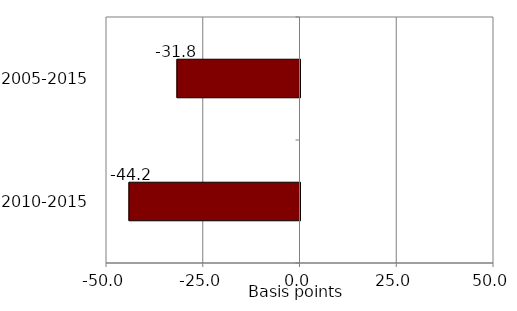
| Category | Series 0 |
|---|---|
| 2010-2015 | -44.2 |
| 2005-2015 | -31.8 |